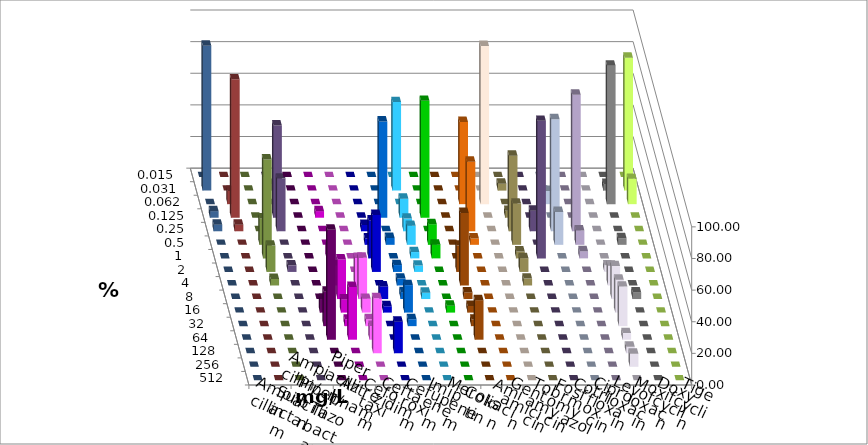
| Category | Ampicillin | Ampicillin/ Sulbactam | Piperacillin | Piperacillin/ Tazobactam | Aztreonam | Cefotaxim | Ceftazidim | Cefuroxim | Imipenem | Meropenem | Colistin | Amikacin | Gentamicin | Tobramycin | Fosfomycin | Cotrimoxazol | Ciprofloxacin | Levofloxacin | Moxifloxacin | Doxycyclin | Tigecyclin |
|---|---|---|---|---|---|---|---|---|---|---|---|---|---|---|---|---|---|---|---|---|---|
| 0.015 | 0 | 0 | 0 | 0 | 0 | 0 | 0 | 0 | 0 | 0 | 0 | 0 | 0 | 0 | 0 | 0 | 0 | 0 | 0 | 0 | 0 |
| 0.031 | 0 | 0 | 0 | 0 | 0 | 56 | 0 | 0 | 0 | 0 | 4.348 | 0 | 0 | 0 | 0 | 4.167 | 84 | 91.667 | 0 | 0 | 4.167 |
| 0.062 | 0 | 0 | 0 | 0 | 0 | 0 | 0 | 0 | 52 | 100 | 0 | 0 | 8.333 | 0 | 0 | 87.5 | 16 | 0 | 8.333 | 0 | 0 |
| 0.125 | 0 | 4.167 | 0 | 0 | 60.87 | 12 | 73.913 | 0 | 0 | 0 | 4.348 | 0 | 0 | 0 | 0 | 0 | 0 | 4.167 | 87.5 | 0 | 58.333 |
| 0.25 | 0 | 0 | 0 | 4 | 0 | 8 | 0 | 0 | 44 | 0 | 47.826 | 13.043 | 70.833 | 86.364 | 0 | 0 | 0 | 4.167 | 4.167 | 0 | 33.333 |
| 0.5 | 0 | 0 | 0 | 4 | 4.348 | 12 | 13.043 | 0 | 4 | 0 | 26.087 | 0 | 20.833 | 9.091 | 0 | 4.167 | 0 | 0 | 0 | 16.667 | 0 |
| 1.0 | 0 | 8.333 | 0 | 24 | 0 | 4 | 8.696 | 0 | 0 | 0 | 4.348 | 86.957 | 0 | 4.545 | 0 | 0 | 0 | 0 | 0 | 62.5 | 0 |
| 2.0 | 0 | 4.167 | 0 | 36 | 4.348 | 4 | 0 | 16.667 | 0 | 0 | 8.696 | 0 | 0 | 0 | 4.167 | 0 | 0 | 0 | 0 | 16.667 | 4.167 |
| 4.0 | 0 | 12.5 | 17.391 | 0 | 4.348 | 0 | 0 | 45.833 | 0 | 0 | 4.348 | 0 | 0 | 0 | 12.5 | 0 | 0 | 0 | 0 | 4.167 | 0 |
| 8.0 | 0 | 25 | 26.087 | 8 | 4.348 | 4 | 0 | 4.167 | 0 | 0 | 0 | 0 | 0 | 0 | 20.833 | 4.167 | 0 | 0 | 0 | 0 | 0 |
| 16.0 | 8.696 | 8.333 | 8.696 | 4 | 17.391 | 0 | 4.348 | 4.167 | 0 | 0 | 0 | 0 | 0 | 0 | 20.833 | 0 | 0 | 0 | 0 | 0 | 0 |
| 32.0 | 21.739 | 4.167 | 4.348 | 0 | 4.348 | 0 | 0 | 4.167 | 0 | 0 | 0 | 0 | 0 | 0 | 25 | 0 | 0 | 0 | 0 | 0 | 0 |
| 64.0 | 69.565 | 33.333 | 8.696 | 0 | 0 | 0 | 0 | 25 | 0 | 0 | 0 | 0 | 0 | 0 | 4.167 | 0 | 0 | 0 | 0 | 0 | 0 |
| 128.0 | 0 | 0 | 34.783 | 20 | 0 | 0 | 0 | 0 | 0 | 0 | 0 | 0 | 0 | 0 | 4.167 | 0 | 0 | 0 | 0 | 0 | 0 |
| 256.0 | 0 | 0 | 0 | 0 | 0 | 0 | 0 | 0 | 0 | 0 | 0 | 0 | 0 | 0 | 8.333 | 0 | 0 | 0 | 0 | 0 | 0 |
| 512.0 | 0 | 0 | 0 | 0 | 0 | 0 | 0 | 0 | 0 | 0 | 0 | 0 | 0 | 0 | 0 | 0 | 0 | 0 | 0 | 0 | 0 |